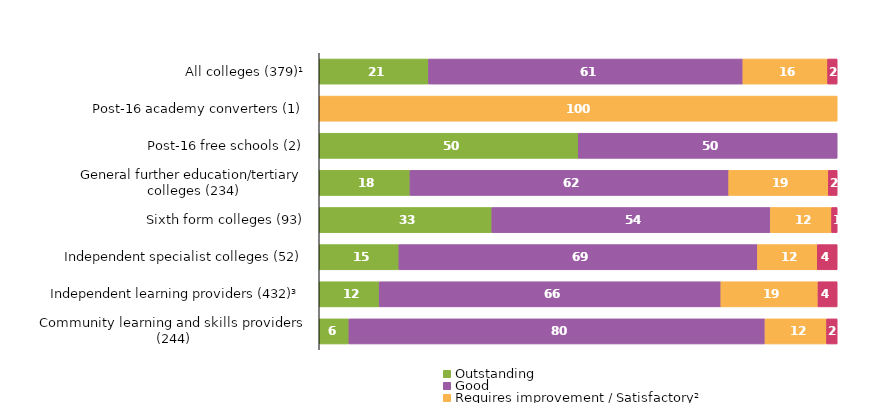
| Category | Outstanding | Good | Requires improvement / Satisfactory² | Inadequate |
|---|---|---|---|---|
| All colleges (379)¹ | 21.108 | 60.686 | 16.359 | 1.847 |
| Post-16 academy converters (1) | 0 | 0 | 100 | 0 |
| Post-16 free schools (2) | 50 | 50 | 0 | 0 |
| General further education/tertiary colleges (234) | 17.521 | 61.538 | 19.231 | 1.709 |
| Sixth form colleges (93) | 33.333 | 53.763 | 11.828 | 1.075 |
| Independent specialist colleges (52) | 15.385 | 69.231 | 11.538 | 3.846 |
| Independent learning providers (432)³ | 11.574 | 65.972 | 18.75 | 3.704 |
| Community learning and skills providers (244) | 5.738 | 80.328 | 11.885 | 2.049 |